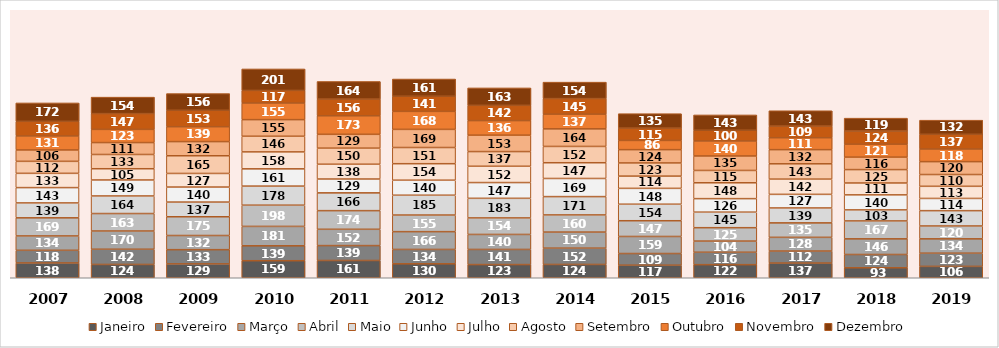
| Category | Janeiro | Fevereiro | Março | Abril | Maio | Junho | Julho | Agosto | Setembro | Outubro | Novembro | Dezembro |
|---|---|---|---|---|---|---|---|---|---|---|---|---|
| 2007 | 138 | 118 | 134 | 169 | 139 | 143 | 133 | 112 | 106 | 131 | 136 | 172 |
| 2008 | 124 | 142 | 170 | 163 | 164 | 149 | 105 | 133 | 111 | 123 | 147 | 154 |
| 2009 | 129 | 133 | 132 | 175 | 137 | 140 | 127 | 165 | 132 | 139 | 153 | 156 |
| 2010 | 159 | 139 | 181 | 198 | 178 | 161 | 158 | 146 | 155 | 155 | 117 | 201 |
| 2011 | 161 | 139 | 152 | 174 | 166 | 129 | 138 | 150 | 129 | 173 | 156 | 164 |
| 2012 | 130 | 134 | 166 | 155 | 185 | 140 | 154 | 151 | 169 | 168 | 141 | 161 |
| 2013 | 123 | 141 | 140 | 154 | 183 | 147 | 152 | 137 | 153 | 136 | 142 | 163 |
| 2014 | 124 | 152 | 150 | 160 | 171 | 169 | 147 | 152 | 164 | 137 | 145 | 154 |
| 2015 | 117 | 109 | 159 | 147 | 154 | 148 | 114 | 123 | 124 | 86 | 115 | 135 |
| 2016 | 122 | 116 | 104 | 125 | 145 | 126 | 148 | 115 | 135 | 140 | 100 | 143 |
| 2017 | 137 | 112 | 128 | 135 | 139 | 127 | 142 | 143 | 132 | 111 | 109 | 143 |
| 2018 | 93 | 124 | 146 | 167 | 103 | 140 | 111 | 125 | 116 | 121 | 124 | 119 |
| 2019 | 106 | 123 | 134 | 120 | 143 | 114 | 113 | 110 | 120 | 118 | 137 | 132 |